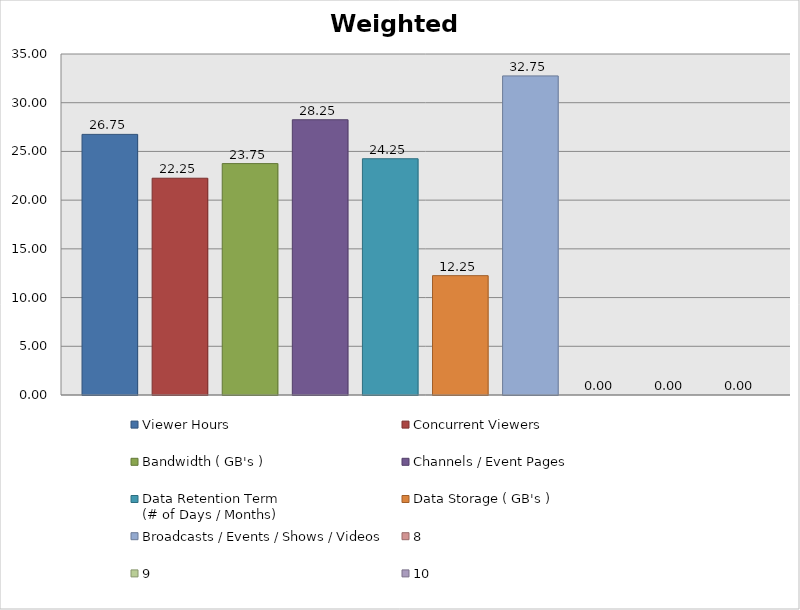
| Category | Viewer Hours | Concurrent Viewers | Bandwidth ( GB's ) | Channels / Event Pages | Data Retention Term
(# of Days / Months) | Data Storage ( GB's ) | Broadcasts / Events / Shows / Videos | Series 7 | Series 8 | Series 9 |
|---|---|---|---|---|---|---|---|---|---|---|
| 0 | 26.75 | 22.25 | 23.75 | 28.25 | 24.25 | 12.25 | 32.75 | 0 | 0 | 0 |